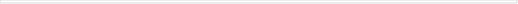
| Category | Total basic infrastructure | Private | Federal | S&L  |
|---|---|---|---|---|
| 0 | 29809.831 | 16782 | 1318.84 | 11708.991 |
| 1 | 38947.622 | 20159 | 2777.84 | 16010.782 |
| 2 | 50447.244 | 23994 | 3399.66 | 23053.584 |
| 3 | 57093.327 | 25041 | 3900.283 | 28152.044 |
| 4 | 54428.568 | 24558 | 4820.011 | 25050.557 |
| 5 | 58125.056 | 26740 | 4982.753 | 26402.303 |
| 6 | 67028.659 | 29344 | 4732.43 | 32952.229 |
| 7 | 73084.996 | 23867 | 3753.045 | 45464.951 |
| 8 | 73001.197 | 19472 | 2651.354 | 50877.843 |
| 9 | 77910.105 | 21777 | 2964.505 | 53168.6 |
| 10 | 84134.353 | 24735 | 3699.824 | 55699.529 |
| 11 | 89569.668 | 20875 | 4620.736 | 64073.932 |
| 12 | 92736.425 | 17309 | 4974.004 | 70453.421 |
| 13 | 91220.321 | 17101 | 5592.736 | 68526.585 |
| 14 | 95911.04 | 13794 | 6656.601 | 75460.439 |
| 15 | 97629.89 | 13198 | 7261.192 | 77170.698 |
| 16 | 105736.971 | 13243 | 7309.87 | 85184.101 |
| 17 | 113683.645 | 16576 | 7646.016 | 89461.629 |
| 18 | 123422.535 | 21373 | 7980.125 | 94069.41 |
| 19 | 130043.137 | 26776 | 8195.219 | 95071.918 |
| 20 | 135267.46 | 34259 | 5779.228 | 95229.232 |
| 21 | 147315.248 | 40359 | 4739.255 | 102216.993 |
| 22 | 130508.328 | 37380 | 3321.48 | 89806.848 |
| 23 | 121458.769 | 36812 | 3359.441 | 81287.328 |
| 24 | 115070.264 | 35419 | 4095.944 | 75555.32 |
| 25 | 113854.517 | 39396 | 4211.73 | 70246.787 |
| 26 | 110498.571 | 42131 | 4407.371 | 63960.2 |
| 27 | 98468.344 | 35660 | 4115.275 | 58693.069 |
| 28 | 90965.534 | 32112 | 4216.219 | 54637.315 |
| 29 | 92482.569 | 33590 | 4372.646 | 54519.923 |
| 30 | 87565.094 | 30852 | 4749.831 | 51963.263 |
| 31 | 102871.105 | 28885 | 6308.586 | 67677.519 |
| 32 | 109962.086 | 28693 | 5811.991 | 75457.095 |
| 33 | 103646.358 | 26631 | 5350.408 | 71664.95 |
| 34 | 86266.927 | 25180 | 4978.967 | 56107.96 |
| 35 | 65389.731 | 17199 | 3418.857 | 44771.874 |
| 36 | 57720.363 | 10002 | 3154.618 | 44563.745 |
| 37 | 83562.567 | 21786 | 1957.328 | 59819.239 |
| 38 | 109018.913 | 35675 | 3011.683 | 70332.23 |
| 39 | 103027.294 | 27468 | 1484.106 | 74075.188 |
| 40 | 106256.563 | 28951 | 2201.869 | 75103.694 |
| 41 | 95044.963 | 14849 | 2488.079 | 77707.884 |
| 42 | 94132.465 | 17255 | 2210.19 | 74667.275 |
| 43 | 106041.893 | 21563 | 1464.919 | 83013.974 |
| 44 | 104175.406 | 20975 | 1921.886 | 81278.52 |
| 45 | 103089.691 | 20613 | 2963.156 | 79513.535 |
| 46 | 106739.328 | 23483 | 2857.457 | 80398.871 |
| 47 | 96257.072 | 11796 | 2644.003 | 81817.069 |
| 48 | 97291.561 | 21018 | 2377.619 | 73895.942 |
| 49 | 95123.276 | 18790 | 850.596 | 75482.68 |
| 50 | 90496.699 | 13078 | -314.411 | 77733.11 |
| 51 | 103682.102 | 23478 | -444.147 | 80648.249 |
| 52 | 109074.375 | 22144 | -145.481 | 87075.856 |
| 53 | 130121.544 | 37208 | -31.287 | 92944.831 |
| 54 | 140108.699 | 38397 | 398.66 | 101313.039 |
| 55 | 137164.088 | 32025 | 1194.323 | 103944.765 |
| 56 | 136075.782 | 30913 | 1604.086 | 103558.696 |
| 57 | 113651.786 | 14717 | 1313.522 | 97621.264 |
| 58 | 103549.063 | 16960 | 360.353 | 86228.71 |
| 59 | 111077.645 | 27167 | 456.343 | 83454.302 |
| 60 | 130355.174 | 54440 | -32.289 | 75947.463 |
| 61 | 132167.731 | 61351 | -62.196 | 70878.927 |
| 62 | 133008.178 | 57055 | 880.139 | 75073.039 |
| 63 | 116042.262 | 42983 | 2651.799 | 70407.463 |
| 64 | 103785.424 | 40915 | 2498.897 | 60371.527 |
| 65 | 102594.092 | 51301.725 | 526.642 | 50765.725 |
| 66 | 90350.45 | 45417.982 | -195.514 | 45127.982 |
| 67 | 107452.064 | 60183.811 | 267.442 | 47000.811 |
| 68 | 113483.84 | 58519.218 | 1225.404 | 53739.218 |
| 69 | 114254.945 | 57863.114 | 1020.717 | 55371.114 |
| 70 | 103828.618 | 49857.191 | 39.236 | 53932.191 |